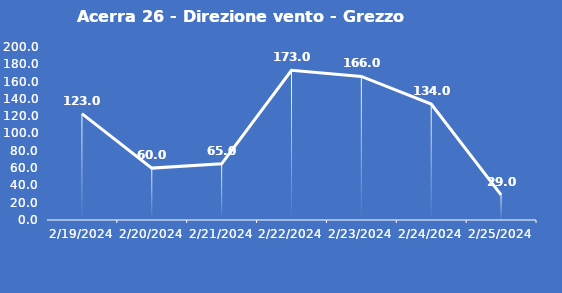
| Category | Acerra 26 - Direzione vento - Grezzo (°N) |
|---|---|
| 2/19/24 | 123 |
| 2/20/24 | 60 |
| 2/21/24 | 65 |
| 2/22/24 | 173 |
| 2/23/24 | 166 |
| 2/24/24 | 134 |
| 2/25/24 | 29 |